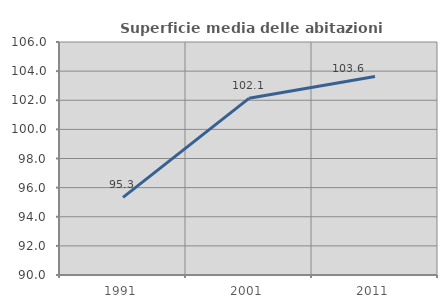
| Category | Superficie media delle abitazioni occupate |
|---|---|
| 1991.0 | 95.33 |
| 2001.0 | 102.134 |
| 2011.0 | 103.633 |